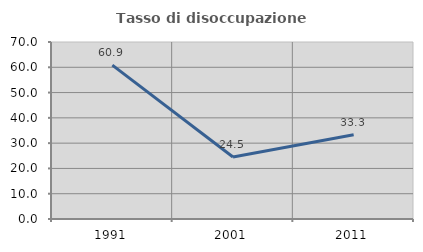
| Category | Tasso di disoccupazione giovanile  |
|---|---|
| 1991.0 | 60.87 |
| 2001.0 | 24.528 |
| 2011.0 | 33.333 |